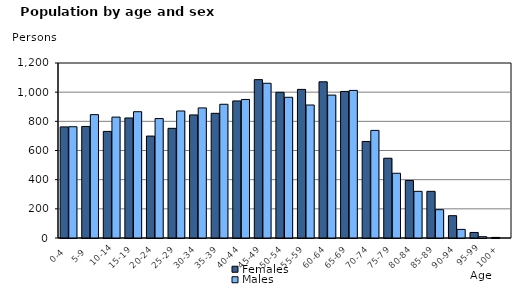
| Category | Females | Males |
|---|---|---|
|   0-4  | 762 | 763 |
|   5-9  | 765 | 846 |
| 10-14 | 731 | 829 |
| 15-19  | 823 | 866 |
| 20-24  | 699 | 819 |
| 25-29  | 752 | 871 |
| 30-34  | 844 | 892 |
| 35-39  | 855 | 917 |
| 40-44  | 940 | 950 |
| 45-49  | 1086 | 1061 |
| 50-54  | 999 | 965 |
| 55-59  | 1019 | 912 |
| 60-64  | 1071 | 980 |
| 65-69  | 1005 | 1012 |
| 70-74  | 662 | 738 |
| 75-79  | 547 | 444 |
| 80-84  | 394 | 320 |
| 85-89  | 320 | 194 |
| 90-94  | 153 | 59 |
| 95-99 | 38 | 9 |
| 100+ | 4 | 0 |